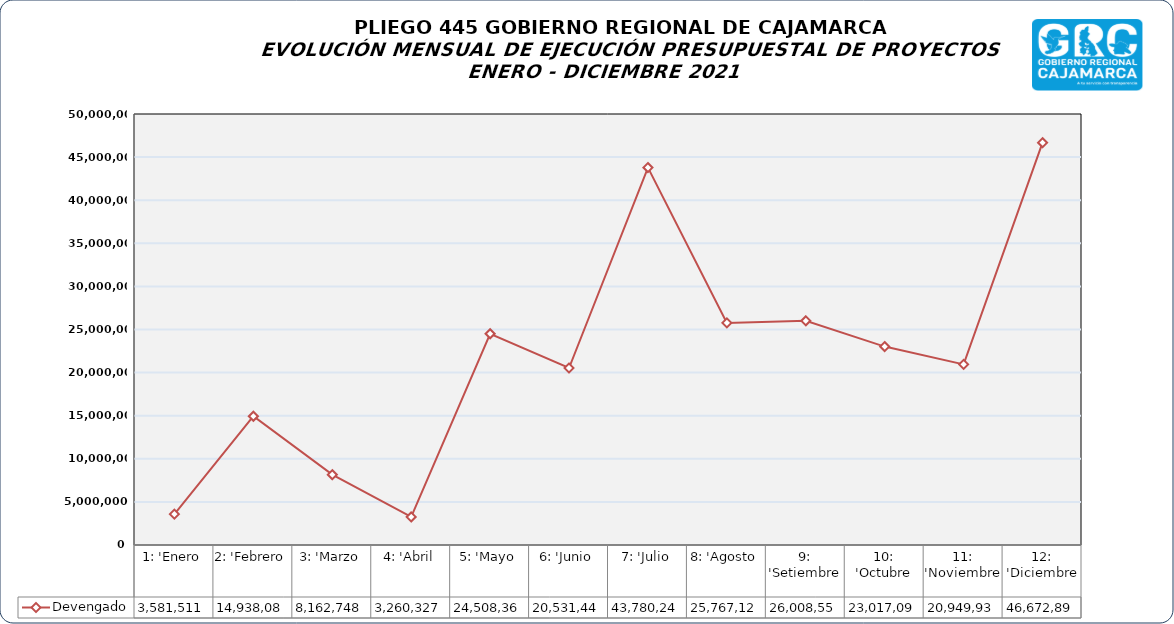
| Category | Devengado  |
|---|---|
| 1: 'Enero | 3581511 |
| 2: 'Febrero | 14938085 |
| 3: 'Marzo | 8162748 |
| 4: 'Abril | 3260327 |
| 5: 'Mayo | 24508364 |
| 6: 'Junio | 20531447 |
| 7: 'Julio | 43780243 |
| 8: 'Agosto | 25767120 |
| 9: 'Setiembre | 26008557 |
| 10: 'Octubre | 23017094 |
| 11: 'Noviembre | 20949931 |
| 12: 'Diciembre | 46672893 |